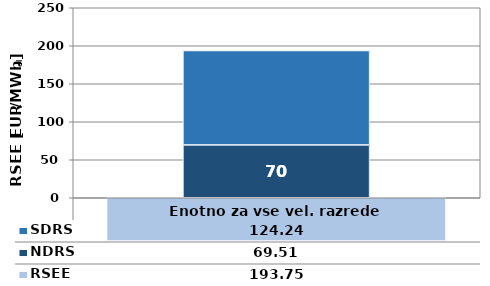
| Category | NDRS | SDRS |
|---|---|---|
| 0 | 69.51 | 124.24 |